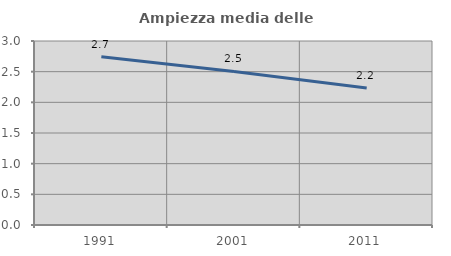
| Category | Ampiezza media delle famiglie |
|---|---|
| 1991.0 | 2.743 |
| 2001.0 | 2.503 |
| 2011.0 | 2.235 |